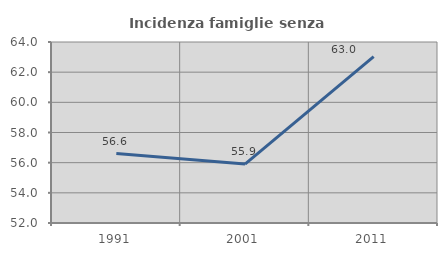
| Category | Incidenza famiglie senza nuclei |
|---|---|
| 1991.0 | 56.607 |
| 2001.0 | 55.908 |
| 2011.0 | 63.036 |